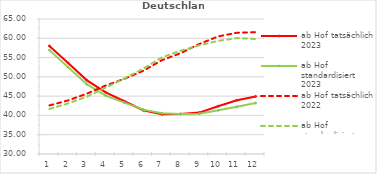
| Category | ab Hof tatsächlich 2023 | ab Hof standardisiert 2023 | ab Hof tatsächlich 2022 | ab Hof standardisiert 2022 |
|---|---|---|---|---|
| 0 | 58.016 | 56.933 | 42.587 | 41.66 |
| 1 | 53.613 | 52.468 | 43.895 | 43.126 |
| 2 | 49.099 | 48.078 | 45.64 | 44.862 |
| 3 | 45.988 | 45.147 | 47.747 | 47.202 |
| 4 | 43.678 | 43.332 | 49.489 | 49.591 |
| 5 | 41.354 | 41.505 | 51.558 | 52.084 |
| 6 | 40.292 | 40.573 | 54.321 | 55.039 |
| 7 | 40.369 | 40.39 | 56.139 | 56.771 |
| 8 | 40.732 | 40.46 | 58.54 | 58.188 |
| 9 | 42.393 | 41.316 | 60.483 | 59.335 |
| 10 | 43.93 | 42.231 | 61.442 | 60.044 |
| 11 | 44.93 | 43.197 | 61.58 | 59.812 |